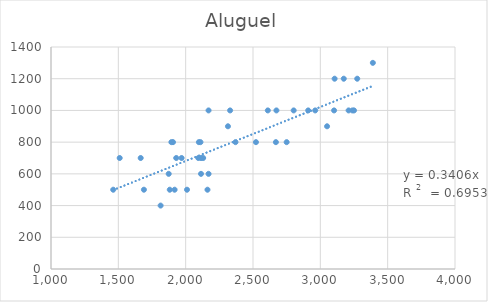
| Category | Aluguel |
|---|---|
| 1894.0 | 800 |
| 2802.0 | 1000 |
| 2750.0 | 800 |
| 2110.0 | 800 |
| 1970.0 | 700 |
| 2098.0 | 800 |
| 1930.0 | 700 |
| 2130.0 | 700 |
| 2330.0 | 1000 |
| 2010.0 | 500 |
| 2674.0 | 1000 |
| 2370.0 | 800 |
| 1906.0 | 800 |
| 2114.0 | 600 |
| 2910.0 | 1000 |
| 1510.0 | 700 |
| 1874.0 | 600 |
| 2094.0 | 700 |
| 2670.0 | 800 |
| 3390.0 | 1300 |
| 1882.0 | 500 |
| 3050.0 | 900 |
| 3174.0 | 1200 |
| 2114.0 | 700 |
| 1690.0 | 500 |
| 1918.0 | 500 |
| 3238.0 | 1000 |
| 1814.0 | 400 |
| 2610.0 | 1000 |
| 1462.0 | 500 |
| 3106.0 | 1200 |
| 2522.0 | 800 |
| 1666.0 | 700 |
| 3274.0 | 1200 |
| 3102.0 | 1000 |
| 3210.0 | 1000 |
| 2170.0 | 1000 |
| 2962.0 | 1000 |
| 2170.0 | 600 |
| 3250.0 | 1000 |
| 2314.0 | 900 |
| 2162.0 | 500 |